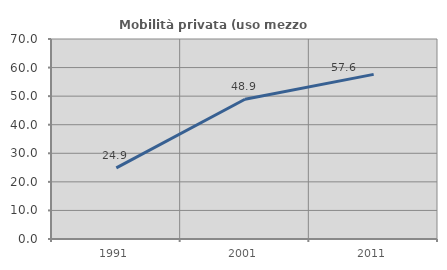
| Category | Mobilità privata (uso mezzo privato) |
|---|---|
| 1991.0 | 24.883 |
| 2001.0 | 48.921 |
| 2011.0 | 57.627 |